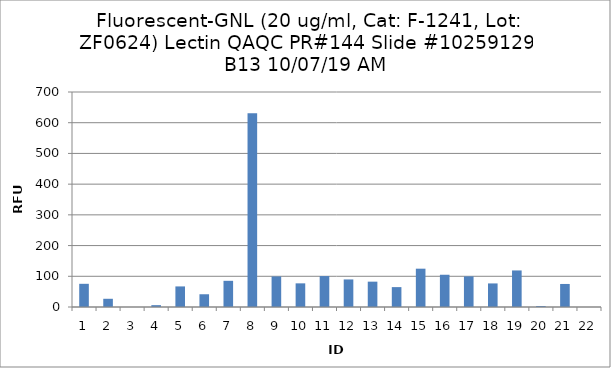
| Category | Series 0 |
|---|---|
| 0 | 75.5 |
| 1 | 26.75 |
| 2 | -0.75 |
| 3 | 6 |
| 4 | 67 |
| 5 | 41.5 |
| 6 | 85.25 |
| 7 | 631 |
| 8 | 99.5 |
| 9 | 77 |
| 10 | 100.75 |
| 11 | 89.75 |
| 12 | 82.5 |
| 13 | 64.75 |
| 14 | 124.75 |
| 15 | 105 |
| 16 | 99.75 |
| 17 | 76.75 |
| 18 | 119 |
| 19 | 3 |
| 20 | 75 |
| 21 | -0.5 |